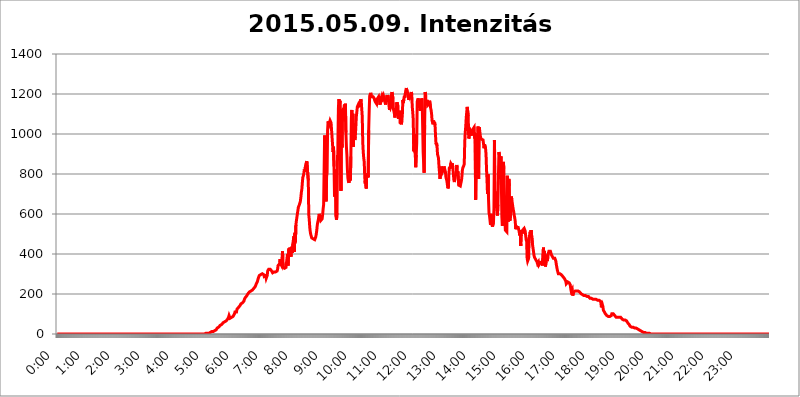
| Category | 2015.05.09. Intenzitás [W/m^2] |
|---|---|
| 0.0 | 0 |
| 0.0006944444444444445 | 0 |
| 0.001388888888888889 | 0 |
| 0.0020833333333333333 | 0 |
| 0.002777777777777778 | 0 |
| 0.003472222222222222 | 0 |
| 0.004166666666666667 | 0 |
| 0.004861111111111111 | 0 |
| 0.005555555555555556 | 0 |
| 0.0062499999999999995 | 0 |
| 0.006944444444444444 | 0 |
| 0.007638888888888889 | 0 |
| 0.008333333333333333 | 0 |
| 0.009027777777777779 | 0 |
| 0.009722222222222222 | 0 |
| 0.010416666666666666 | 0 |
| 0.011111111111111112 | 0 |
| 0.011805555555555555 | 0 |
| 0.012499999999999999 | 0 |
| 0.013194444444444444 | 0 |
| 0.013888888888888888 | 0 |
| 0.014583333333333332 | 0 |
| 0.015277777777777777 | 0 |
| 0.015972222222222224 | 0 |
| 0.016666666666666666 | 0 |
| 0.017361111111111112 | 0 |
| 0.018055555555555557 | 0 |
| 0.01875 | 0 |
| 0.019444444444444445 | 0 |
| 0.02013888888888889 | 0 |
| 0.020833333333333332 | 0 |
| 0.02152777777777778 | 0 |
| 0.022222222222222223 | 0 |
| 0.02291666666666667 | 0 |
| 0.02361111111111111 | 0 |
| 0.024305555555555556 | 0 |
| 0.024999999999999998 | 0 |
| 0.025694444444444447 | 0 |
| 0.02638888888888889 | 0 |
| 0.027083333333333334 | 0 |
| 0.027777777777777776 | 0 |
| 0.02847222222222222 | 0 |
| 0.029166666666666664 | 0 |
| 0.029861111111111113 | 0 |
| 0.030555555555555555 | 0 |
| 0.03125 | 0 |
| 0.03194444444444445 | 0 |
| 0.03263888888888889 | 0 |
| 0.03333333333333333 | 0 |
| 0.034027777777777775 | 0 |
| 0.034722222222222224 | 0 |
| 0.035416666666666666 | 0 |
| 0.036111111111111115 | 0 |
| 0.03680555555555556 | 0 |
| 0.0375 | 0 |
| 0.03819444444444444 | 0 |
| 0.03888888888888889 | 0 |
| 0.03958333333333333 | 0 |
| 0.04027777777777778 | 0 |
| 0.04097222222222222 | 0 |
| 0.041666666666666664 | 0 |
| 0.042361111111111106 | 0 |
| 0.04305555555555556 | 0 |
| 0.043750000000000004 | 0 |
| 0.044444444444444446 | 0 |
| 0.04513888888888889 | 0 |
| 0.04583333333333334 | 0 |
| 0.04652777777777778 | 0 |
| 0.04722222222222222 | 0 |
| 0.04791666666666666 | 0 |
| 0.04861111111111111 | 0 |
| 0.049305555555555554 | 0 |
| 0.049999999999999996 | 0 |
| 0.05069444444444445 | 0 |
| 0.051388888888888894 | 0 |
| 0.052083333333333336 | 0 |
| 0.05277777777777778 | 0 |
| 0.05347222222222222 | 0 |
| 0.05416666666666667 | 0 |
| 0.05486111111111111 | 0 |
| 0.05555555555555555 | 0 |
| 0.05625 | 0 |
| 0.05694444444444444 | 0 |
| 0.057638888888888885 | 0 |
| 0.05833333333333333 | 0 |
| 0.05902777777777778 | 0 |
| 0.059722222222222225 | 0 |
| 0.06041666666666667 | 0 |
| 0.061111111111111116 | 0 |
| 0.06180555555555556 | 0 |
| 0.0625 | 0 |
| 0.06319444444444444 | 0 |
| 0.06388888888888888 | 0 |
| 0.06458333333333334 | 0 |
| 0.06527777777777778 | 0 |
| 0.06597222222222222 | 0 |
| 0.06666666666666667 | 0 |
| 0.06736111111111111 | 0 |
| 0.06805555555555555 | 0 |
| 0.06874999999999999 | 0 |
| 0.06944444444444443 | 0 |
| 0.07013888888888889 | 0 |
| 0.07083333333333333 | 0 |
| 0.07152777777777779 | 0 |
| 0.07222222222222223 | 0 |
| 0.07291666666666667 | 0 |
| 0.07361111111111111 | 0 |
| 0.07430555555555556 | 0 |
| 0.075 | 0 |
| 0.07569444444444444 | 0 |
| 0.0763888888888889 | 0 |
| 0.07708333333333334 | 0 |
| 0.07777777777777778 | 0 |
| 0.07847222222222222 | 0 |
| 0.07916666666666666 | 0 |
| 0.0798611111111111 | 0 |
| 0.08055555555555556 | 0 |
| 0.08125 | 0 |
| 0.08194444444444444 | 0 |
| 0.08263888888888889 | 0 |
| 0.08333333333333333 | 0 |
| 0.08402777777777777 | 0 |
| 0.08472222222222221 | 0 |
| 0.08541666666666665 | 0 |
| 0.08611111111111112 | 0 |
| 0.08680555555555557 | 0 |
| 0.08750000000000001 | 0 |
| 0.08819444444444445 | 0 |
| 0.08888888888888889 | 0 |
| 0.08958333333333333 | 0 |
| 0.09027777777777778 | 0 |
| 0.09097222222222222 | 0 |
| 0.09166666666666667 | 0 |
| 0.09236111111111112 | 0 |
| 0.09305555555555556 | 0 |
| 0.09375 | 0 |
| 0.09444444444444444 | 0 |
| 0.09513888888888888 | 0 |
| 0.09583333333333333 | 0 |
| 0.09652777777777777 | 0 |
| 0.09722222222222222 | 0 |
| 0.09791666666666667 | 0 |
| 0.09861111111111111 | 0 |
| 0.09930555555555555 | 0 |
| 0.09999999999999999 | 0 |
| 0.10069444444444443 | 0 |
| 0.1013888888888889 | 0 |
| 0.10208333333333335 | 0 |
| 0.10277777777777779 | 0 |
| 0.10347222222222223 | 0 |
| 0.10416666666666667 | 0 |
| 0.10486111111111111 | 0 |
| 0.10555555555555556 | 0 |
| 0.10625 | 0 |
| 0.10694444444444444 | 0 |
| 0.1076388888888889 | 0 |
| 0.10833333333333334 | 0 |
| 0.10902777777777778 | 0 |
| 0.10972222222222222 | 0 |
| 0.1111111111111111 | 0 |
| 0.11180555555555556 | 0 |
| 0.11180555555555556 | 0 |
| 0.1125 | 0 |
| 0.11319444444444444 | 0 |
| 0.11388888888888889 | 0 |
| 0.11458333333333333 | 0 |
| 0.11527777777777777 | 0 |
| 0.11597222222222221 | 0 |
| 0.11666666666666665 | 0 |
| 0.1173611111111111 | 0 |
| 0.11805555555555557 | 0 |
| 0.11944444444444445 | 0 |
| 0.12013888888888889 | 0 |
| 0.12083333333333333 | 0 |
| 0.12152777777777778 | 0 |
| 0.12222222222222223 | 0 |
| 0.12291666666666667 | 0 |
| 0.12291666666666667 | 0 |
| 0.12361111111111112 | 0 |
| 0.12430555555555556 | 0 |
| 0.125 | 0 |
| 0.12569444444444444 | 0 |
| 0.12638888888888888 | 0 |
| 0.12708333333333333 | 0 |
| 0.16875 | 0 |
| 0.12847222222222224 | 0 |
| 0.12916666666666668 | 0 |
| 0.12986111111111112 | 0 |
| 0.13055555555555556 | 0 |
| 0.13125 | 0 |
| 0.13194444444444445 | 0 |
| 0.1326388888888889 | 0 |
| 0.13333333333333333 | 0 |
| 0.13402777777777777 | 0 |
| 0.13402777777777777 | 0 |
| 0.13472222222222222 | 0 |
| 0.13541666666666666 | 0 |
| 0.1361111111111111 | 0 |
| 0.13749999999999998 | 0 |
| 0.13819444444444443 | 0 |
| 0.1388888888888889 | 0 |
| 0.13958333333333334 | 0 |
| 0.14027777777777778 | 0 |
| 0.14097222222222222 | 0 |
| 0.14166666666666666 | 0 |
| 0.1423611111111111 | 0 |
| 0.14305555555555557 | 0 |
| 0.14375000000000002 | 0 |
| 0.14444444444444446 | 0 |
| 0.1451388888888889 | 0 |
| 0.1451388888888889 | 0 |
| 0.14652777777777778 | 0 |
| 0.14722222222222223 | 0 |
| 0.14791666666666667 | 0 |
| 0.1486111111111111 | 0 |
| 0.14930555555555555 | 0 |
| 0.15 | 0 |
| 0.15069444444444444 | 0 |
| 0.15138888888888888 | 0 |
| 0.15208333333333332 | 0 |
| 0.15277777777777776 | 0 |
| 0.15347222222222223 | 0 |
| 0.15416666666666667 | 0 |
| 0.15486111111111112 | 0 |
| 0.15555555555555556 | 0 |
| 0.15625 | 0 |
| 0.15694444444444444 | 0 |
| 0.15763888888888888 | 0 |
| 0.15833333333333333 | 0 |
| 0.15902777777777777 | 0 |
| 0.15972222222222224 | 0 |
| 0.16041666666666668 | 0 |
| 0.16111111111111112 | 0 |
| 0.16180555555555556 | 0 |
| 0.1625 | 0 |
| 0.16319444444444445 | 0 |
| 0.1638888888888889 | 0 |
| 0.16458333333333333 | 0 |
| 0.16527777777777777 | 0 |
| 0.16597222222222222 | 0 |
| 0.16666666666666666 | 0 |
| 0.1673611111111111 | 0 |
| 0.16805555555555554 | 0 |
| 0.16874999999999998 | 0 |
| 0.16944444444444443 | 0 |
| 0.17013888888888887 | 0 |
| 0.1708333333333333 | 0 |
| 0.17152777777777775 | 0 |
| 0.17222222222222225 | 0 |
| 0.1729166666666667 | 0 |
| 0.17361111111111113 | 0 |
| 0.17430555555555557 | 0 |
| 0.17500000000000002 | 0 |
| 0.17569444444444446 | 0 |
| 0.1763888888888889 | 0 |
| 0.17708333333333334 | 0 |
| 0.17777777777777778 | 0 |
| 0.17847222222222223 | 0 |
| 0.17916666666666667 | 0 |
| 0.1798611111111111 | 0 |
| 0.18055555555555555 | 0 |
| 0.18125 | 0 |
| 0.18194444444444444 | 0 |
| 0.1826388888888889 | 0 |
| 0.18333333333333335 | 0 |
| 0.1840277777777778 | 0 |
| 0.18472222222222223 | 0 |
| 0.18541666666666667 | 0 |
| 0.18611111111111112 | 0 |
| 0.18680555555555556 | 0 |
| 0.1875 | 0 |
| 0.18819444444444444 | 0 |
| 0.18888888888888888 | 0 |
| 0.18958333333333333 | 0 |
| 0.19027777777777777 | 0 |
| 0.1909722222222222 | 0 |
| 0.19166666666666665 | 0 |
| 0.19236111111111112 | 0 |
| 0.19305555555555554 | 0 |
| 0.19375 | 0 |
| 0.19444444444444445 | 0 |
| 0.1951388888888889 | 0 |
| 0.19583333333333333 | 0 |
| 0.19652777777777777 | 0 |
| 0.19722222222222222 | 0 |
| 0.19791666666666666 | 0 |
| 0.1986111111111111 | 0 |
| 0.19930555555555554 | 0 |
| 0.19999999999999998 | 0 |
| 0.20069444444444443 | 0 |
| 0.20138888888888887 | 0 |
| 0.2020833333333333 | 0 |
| 0.2027777777777778 | 0 |
| 0.2034722222222222 | 0 |
| 0.2041666666666667 | 0 |
| 0.20486111111111113 | 0 |
| 0.20555555555555557 | 0 |
| 0.20625000000000002 | 0 |
| 0.20694444444444446 | 0 |
| 0.2076388888888889 | 0 |
| 0.20833333333333334 | 3.525 |
| 0.20902777777777778 | 3.525 |
| 0.20972222222222223 | 3.525 |
| 0.21041666666666667 | 3.525 |
| 0.2111111111111111 | 3.525 |
| 0.21180555555555555 | 3.525 |
| 0.2125 | 3.525 |
| 0.21319444444444444 | 3.525 |
| 0.2138888888888889 | 7.887 |
| 0.21458333333333335 | 7.887 |
| 0.2152777777777778 | 7.887 |
| 0.21597222222222223 | 7.887 |
| 0.21666666666666667 | 12.257 |
| 0.21736111111111112 | 12.257 |
| 0.21805555555555556 | 12.257 |
| 0.21875 | 12.257 |
| 0.21944444444444444 | 16.636 |
| 0.22013888888888888 | 16.636 |
| 0.22083333333333333 | 16.636 |
| 0.22152777777777777 | 21.024 |
| 0.2222222222222222 | 21.024 |
| 0.22291666666666665 | 21.024 |
| 0.2236111111111111 | 25.419 |
| 0.22430555555555556 | 29.823 |
| 0.225 | 29.823 |
| 0.22569444444444445 | 34.234 |
| 0.2263888888888889 | 34.234 |
| 0.22708333333333333 | 38.653 |
| 0.22777777777777777 | 38.653 |
| 0.22847222222222222 | 43.079 |
| 0.22916666666666666 | 43.079 |
| 0.2298611111111111 | 47.511 |
| 0.23055555555555554 | 47.511 |
| 0.23124999999999998 | 51.951 |
| 0.23194444444444443 | 51.951 |
| 0.23263888888888887 | 56.398 |
| 0.2333333333333333 | 56.398 |
| 0.2340277777777778 | 56.398 |
| 0.2347222222222222 | 60.85 |
| 0.2354166666666667 | 60.85 |
| 0.23611111111111113 | 65.31 |
| 0.23680555555555557 | 65.31 |
| 0.23750000000000002 | 65.31 |
| 0.23819444444444446 | 69.775 |
| 0.2388888888888889 | 74.246 |
| 0.23958333333333334 | 74.246 |
| 0.24027777777777778 | 83.205 |
| 0.24097222222222223 | 92.184 |
| 0.24166666666666667 | 87.692 |
| 0.2423611111111111 | 78.722 |
| 0.24305555555555555 | 78.722 |
| 0.24375 | 83.205 |
| 0.24444444444444446 | 83.205 |
| 0.24513888888888888 | 83.205 |
| 0.24583333333333335 | 83.205 |
| 0.2465277777777778 | 87.692 |
| 0.24722222222222223 | 92.184 |
| 0.24791666666666667 | 92.184 |
| 0.24861111111111112 | 101.184 |
| 0.24930555555555556 | 110.201 |
| 0.25 | 110.201 |
| 0.25069444444444444 | 110.201 |
| 0.2513888888888889 | 110.201 |
| 0.2520833333333333 | 123.758 |
| 0.25277777777777777 | 128.284 |
| 0.2534722222222222 | 128.284 |
| 0.25416666666666665 | 132.814 |
| 0.2548611111111111 | 132.814 |
| 0.2555555555555556 | 137.347 |
| 0.25625000000000003 | 141.884 |
| 0.2569444444444445 | 146.423 |
| 0.2576388888888889 | 150.964 |
| 0.25833333333333336 | 150.964 |
| 0.2590277777777778 | 155.509 |
| 0.25972222222222224 | 155.509 |
| 0.2604166666666667 | 160.056 |
| 0.2611111111111111 | 160.056 |
| 0.26180555555555557 | 164.605 |
| 0.2625 | 173.709 |
| 0.26319444444444445 | 178.264 |
| 0.2638888888888889 | 182.82 |
| 0.26458333333333334 | 187.378 |
| 0.2652777777777778 | 187.378 |
| 0.2659722222222222 | 191.937 |
| 0.26666666666666666 | 191.937 |
| 0.2673611111111111 | 201.058 |
| 0.26805555555555555 | 205.62 |
| 0.26875 | 205.62 |
| 0.26944444444444443 | 210.182 |
| 0.2701388888888889 | 210.182 |
| 0.2708333333333333 | 210.182 |
| 0.27152777777777776 | 214.746 |
| 0.2722222222222222 | 214.746 |
| 0.27291666666666664 | 214.746 |
| 0.2736111111111111 | 219.309 |
| 0.2743055555555555 | 219.309 |
| 0.27499999999999997 | 223.873 |
| 0.27569444444444446 | 228.436 |
| 0.27638888888888885 | 228.436 |
| 0.27708333333333335 | 233 |
| 0.2777777777777778 | 237.564 |
| 0.27847222222222223 | 242.127 |
| 0.2791666666666667 | 251.251 |
| 0.2798611111111111 | 255.813 |
| 0.28055555555555556 | 260.373 |
| 0.28125 | 269.49 |
| 0.28194444444444444 | 278.603 |
| 0.2826388888888889 | 283.156 |
| 0.2833333333333333 | 292.259 |
| 0.28402777777777777 | 296.808 |
| 0.2847222222222222 | 296.808 |
| 0.28541666666666665 | 296.808 |
| 0.28611111111111115 | 296.808 |
| 0.28680555555555554 | 301.354 |
| 0.28750000000000003 | 301.354 |
| 0.2881944444444445 | 296.808 |
| 0.2888888888888889 | 296.808 |
| 0.28958333333333336 | 296.808 |
| 0.2902777777777778 | 287.709 |
| 0.29097222222222224 | 287.709 |
| 0.2916666666666667 | 283.156 |
| 0.2923611111111111 | 292.259 |
| 0.29305555555555557 | 278.603 |
| 0.29375 | 278.603 |
| 0.29444444444444445 | 292.259 |
| 0.2951388888888889 | 314.98 |
| 0.29583333333333334 | 314.98 |
| 0.2965277777777778 | 324.052 |
| 0.2972222222222222 | 324.052 |
| 0.29791666666666666 | 328.584 |
| 0.2986111111111111 | 324.052 |
| 0.29930555555555555 | 324.052 |
| 0.3 | 319.517 |
| 0.30069444444444443 | 314.98 |
| 0.3013888888888889 | 310.44 |
| 0.3020833333333333 | 305.898 |
| 0.30277777777777776 | 305.898 |
| 0.3034722222222222 | 305.898 |
| 0.30416666666666664 | 310.44 |
| 0.3048611111111111 | 310.44 |
| 0.3055555555555555 | 314.98 |
| 0.30624999999999997 | 310.44 |
| 0.3069444444444444 | 310.44 |
| 0.3076388888888889 | 314.98 |
| 0.30833333333333335 | 314.98 |
| 0.3090277777777778 | 324.052 |
| 0.30972222222222223 | 342.162 |
| 0.3104166666666667 | 342.162 |
| 0.3111111111111111 | 337.639 |
| 0.31180555555555556 | 351.198 |
| 0.3125 | 373.729 |
| 0.31319444444444444 | 351.198 |
| 0.3138888888888889 | 346.682 |
| 0.3145833333333333 | 342.162 |
| 0.31527777777777777 | 342.162 |
| 0.3159722222222222 | 414.035 |
| 0.31666666666666665 | 333.113 |
| 0.31736111111111115 | 328.584 |
| 0.31805555555555554 | 328.584 |
| 0.31875000000000003 | 328.584 |
| 0.3194444444444445 | 328.584 |
| 0.3201388888888889 | 328.584 |
| 0.32083333333333336 | 333.113 |
| 0.3215277777777778 | 333.113 |
| 0.32222222222222224 | 337.639 |
| 0.3229166666666667 | 400.638 |
| 0.3236111111111111 | 342.162 |
| 0.32430555555555557 | 342.162 |
| 0.325 | 427.39 |
| 0.32569444444444445 | 387.202 |
| 0.3263888888888889 | 431.833 |
| 0.32708333333333334 | 436.27 |
| 0.3277777777777778 | 387.202 |
| 0.3284722222222222 | 436.27 |
| 0.32916666666666666 | 422.943 |
| 0.3298611111111111 | 405.108 |
| 0.33055555555555555 | 453.968 |
| 0.33125 | 458.38 |
| 0.33194444444444443 | 489.108 |
| 0.3326388888888889 | 409.574 |
| 0.3333333333333333 | 506.542 |
| 0.3340277777777778 | 458.38 |
| 0.3347222222222222 | 545.416 |
| 0.3354166666666667 | 566.793 |
| 0.3361111111111111 | 583.779 |
| 0.3368055555555556 | 600.661 |
| 0.33749999999999997 | 617.436 |
| 0.33819444444444446 | 634.105 |
| 0.33888888888888885 | 638.256 |
| 0.33958333333333335 | 646.537 |
| 0.34027777777777773 | 650.667 |
| 0.34097222222222223 | 663.019 |
| 0.3416666666666666 | 683.473 |
| 0.3423611111111111 | 707.8 |
| 0.3430555555555555 | 723.889 |
| 0.34375 | 755.766 |
| 0.3444444444444445 | 783.342 |
| 0.3451388888888889 | 791.169 |
| 0.3458333333333334 | 802.868 |
| 0.34652777777777777 | 822.26 |
| 0.34722222222222227 | 810.641 |
| 0.34791666666666665 | 833.834 |
| 0.34861111111111115 | 849.199 |
| 0.34930555555555554 | 856.855 |
| 0.35000000000000003 | 864.493 |
| 0.3506944444444444 | 868.305 |
| 0.3513888888888889 | 864.493 |
| 0.3520833333333333 | 767.62 |
| 0.3527777777777778 | 596.45 |
| 0.3534722222222222 | 571.049 |
| 0.3541666666666667 | 532.513 |
| 0.3548611111111111 | 510.885 |
| 0.35555555555555557 | 497.836 |
| 0.35625 | 489.108 |
| 0.35694444444444445 | 480.356 |
| 0.3576388888888889 | 475.972 |
| 0.35833333333333334 | 475.972 |
| 0.3590277777777778 | 475.972 |
| 0.3597222222222222 | 471.582 |
| 0.36041666666666666 | 471.582 |
| 0.3611111111111111 | 471.582 |
| 0.36180555555555555 | 475.972 |
| 0.3625 | 484.735 |
| 0.36319444444444443 | 497.836 |
| 0.3638888888888889 | 515.223 |
| 0.3645833333333333 | 541.121 |
| 0.3652777777777778 | 558.261 |
| 0.3659722222222222 | 566.793 |
| 0.3666666666666667 | 566.793 |
| 0.3673611111111111 | 600.661 |
| 0.3680555555555556 | 592.233 |
| 0.36874999999999997 | 575.299 |
| 0.36944444444444446 | 566.793 |
| 0.37013888888888885 | 562.53 |
| 0.37083333333333335 | 566.793 |
| 0.37152777777777773 | 575.299 |
| 0.37222222222222223 | 596.45 |
| 0.3729166666666666 | 625.784 |
| 0.3736111111111111 | 646.537 |
| 0.3743055555555555 | 650.667 |
| 0.375 | 992.448 |
| 0.3756944444444445 | 883.516 |
| 0.3763888888888889 | 743.859 |
| 0.3770833333333334 | 663.019 |
| 0.37777777777777777 | 787.258 |
| 0.37847222222222227 | 806.757 |
| 0.37916666666666665 | 1018.587 |
| 0.37986111111111115 | 1063.51 |
| 0.38055555555555554 | 1056.004 |
| 0.38125000000000003 | 1048.508 |
| 0.3819444444444444 | 1044.762 |
| 0.3826388888888889 | 1067.267 |
| 0.3833333333333333 | 1071.027 |
| 0.3840277777777778 | 1056.004 |
| 0.3847222222222222 | 1052.255 |
| 0.3854166666666667 | 984.98 |
| 0.3861111111111111 | 988.714 |
| 0.38680555555555557 | 909.996 |
| 0.3875 | 936.33 |
| 0.38819444444444445 | 837.682 |
| 0.3888888888888889 | 687.544 |
| 0.38958333333333334 | 755.766 |
| 0.3902777777777778 | 822.26 |
| 0.3909722222222222 | 588.009 |
| 0.39166666666666666 | 571.049 |
| 0.3923611111111111 | 604.864 |
| 0.39305555555555555 | 894.885 |
| 0.39375 | 868.305 |
| 0.39444444444444443 | 1139.384 |
| 0.3951388888888889 | 1174.263 |
| 0.3958333333333333 | 1147.086 |
| 0.3965277777777778 | 1166.46 |
| 0.3972222222222222 | 1162.571 |
| 0.3979166666666667 | 715.858 |
| 0.3986111111111111 | 1052.255 |
| 0.3993055555555556 | 932.576 |
| 0.39999999999999997 | 1120.238 |
| 0.40069444444444446 | 1116.426 |
| 0.40138888888888885 | 1120.238 |
| 0.40208333333333335 | 1127.879 |
| 0.40277777777777773 | 1147.086 |
| 0.40347222222222223 | 1063.51 |
| 0.4041666666666666 | 1150.946 |
| 0.4048611111111111 | 1007.383 |
| 0.4055555555555555 | 936.33 |
| 0.40625 | 894.885 |
| 0.4069444444444445 | 822.26 |
| 0.4076388888888889 | 779.42 |
| 0.4083333333333334 | 763.674 |
| 0.40902777777777777 | 755.766 |
| 0.40972222222222227 | 771.559 |
| 0.41041666666666665 | 779.42 |
| 0.41111111111111115 | 767.62 |
| 0.41180555555555554 | 887.309 |
| 0.41250000000000003 | 1078.555 |
| 0.4131944444444444 | 1120.238 |
| 0.4138888888888889 | 966.295 |
| 0.4145833333333333 | 1101.226 |
| 0.4152777777777778 | 936.33 |
| 0.4159722222222222 | 1052.255 |
| 0.4166666666666667 | 1003.65 |
| 0.4173611111111111 | 970.034 |
| 0.41805555555555557 | 988.714 |
| 0.41875 | 1033.537 |
| 0.41944444444444445 | 1086.097 |
| 0.4201388888888889 | 1108.816 |
| 0.42083333333333334 | 1135.543 |
| 0.4215277777777778 | 1139.384 |
| 0.4222222222222222 | 1147.086 |
| 0.42291666666666666 | 1139.384 |
| 0.4236111111111111 | 1135.543 |
| 0.42430555555555555 | 1135.543 |
| 0.425 | 1147.086 |
| 0.42569444444444443 | 1174.263 |
| 0.4263888888888889 | 1162.571 |
| 0.4270833333333333 | 1124.056 |
| 0.4277777777777778 | 1086.097 |
| 0.4284722222222222 | 958.814 |
| 0.4291666666666667 | 909.996 |
| 0.4298611111111111 | 879.719 |
| 0.4305555555555556 | 860.676 |
| 0.43124999999999997 | 787.258 |
| 0.43194444444444446 | 751.803 |
| 0.43263888888888885 | 795.074 |
| 0.43333333333333335 | 727.896 |
| 0.43402777777777773 | 795.074 |
| 0.43472222222222223 | 783.342 |
| 0.4354166666666666 | 802.868 |
| 0.4361111111111111 | 783.342 |
| 0.4368055555555555 | 1018.587 |
| 0.4375 | 1116.426 |
| 0.4381944444444445 | 1189.969 |
| 0.4388888888888889 | 1197.876 |
| 0.4395833333333334 | 1205.82 |
| 0.44027777777777777 | 1193.918 |
| 0.44097222222222227 | 1186.03 |
| 0.44166666666666665 | 1186.03 |
| 0.44236111111111115 | 1186.03 |
| 0.44305555555555554 | 1186.03 |
| 0.44375000000000003 | 1186.03 |
| 0.4444444444444444 | 1178.177 |
| 0.4451388888888889 | 1182.099 |
| 0.4458333333333333 | 1162.571 |
| 0.4465277777777778 | 1162.571 |
| 0.4472222222222222 | 1162.571 |
| 0.4479166666666667 | 1150.946 |
| 0.4486111111111111 | 1174.263 |
| 0.44930555555555557 | 1178.177 |
| 0.45 | 1178.177 |
| 0.45069444444444445 | 1186.03 |
| 0.4513888888888889 | 1170.358 |
| 0.45208333333333334 | 1178.177 |
| 0.4527777777777778 | 1147.086 |
| 0.4534722222222222 | 1174.263 |
| 0.45416666666666666 | 1158.689 |
| 0.4548611111111111 | 1186.03 |
| 0.45555555555555555 | 1193.918 |
| 0.45625 | 1189.969 |
| 0.45694444444444443 | 1182.099 |
| 0.4576388888888889 | 1189.969 |
| 0.4583333333333333 | 1189.969 |
| 0.4590277777777778 | 1170.358 |
| 0.4597222222222222 | 1166.46 |
| 0.4604166666666667 | 1147.086 |
| 0.4611111111111111 | 1178.177 |
| 0.4618055555555556 | 1170.358 |
| 0.46249999999999997 | 1193.918 |
| 0.46319444444444446 | 1186.03 |
| 0.46388888888888885 | 1193.918 |
| 0.46458333333333335 | 1166.46 |
| 0.46527777777777773 | 1170.358 |
| 0.46597222222222223 | 1120.238 |
| 0.4666666666666666 | 1139.384 |
| 0.4673611111111111 | 1131.708 |
| 0.4680555555555555 | 1139.384 |
| 0.46875 | 1193.918 |
| 0.4694444444444445 | 1209.807 |
| 0.4701388888888889 | 1205.82 |
| 0.4708333333333334 | 1178.177 |
| 0.47152777777777777 | 1124.056 |
| 0.47222222222222227 | 1127.879 |
| 0.47291666666666665 | 1101.226 |
| 0.47361111111111115 | 1082.324 |
| 0.47430555555555554 | 1112.618 |
| 0.47500000000000003 | 1093.653 |
| 0.4756944444444444 | 1097.437 |
| 0.4763888888888889 | 1158.689 |
| 0.4770833333333333 | 1158.689 |
| 0.4777777777777778 | 1139.384 |
| 0.4784722222222222 | 1074.789 |
| 0.4791666666666667 | 1112.618 |
| 0.4798611111111111 | 1097.437 |
| 0.48055555555555557 | 1116.426 |
| 0.48125 | 1052.255 |
| 0.48194444444444445 | 1067.267 |
| 0.4826388888888889 | 1048.508 |
| 0.48333333333333334 | 1067.267 |
| 0.4840277777777778 | 1097.437 |
| 0.4847222222222222 | 1170.358 |
| 0.48541666666666666 | 1154.814 |
| 0.4861111111111111 | 1174.263 |
| 0.48680555555555555 | 1189.969 |
| 0.4875 | 1182.099 |
| 0.48819444444444443 | 1201.843 |
| 0.4888888888888889 | 1217.812 |
| 0.4895833333333333 | 1229.899 |
| 0.4902777777777778 | 1233.951 |
| 0.4909722222222222 | 1209.807 |
| 0.4916666666666667 | 1201.843 |
| 0.4923611111111111 | 1193.918 |
| 0.4930555555555556 | 1170.358 |
| 0.49374999999999997 | 1193.918 |
| 0.49444444444444446 | 1186.03 |
| 0.49513888888888885 | 1193.918 |
| 0.49583333333333335 | 1201.843 |
| 0.49652777777777773 | 1209.807 |
| 0.49722222222222223 | 1197.876 |
| 0.4979166666666666 | 1135.543 |
| 0.4986111111111111 | 1108.816 |
| 0.4993055555555555 | 1071.027 |
| 0.5 | 913.766 |
| 0.5006944444444444 | 999.916 |
| 0.5013888888888889 | 909.996 |
| 0.5020833333333333 | 902.447 |
| 0.5027777777777778 | 833.834 |
| 0.5034722222222222 | 894.885 |
| 0.5041666666666667 | 955.071 |
| 0.5048611111111111 | 1162.571 |
| 0.5055555555555555 | 1170.358 |
| 0.50625 | 1178.177 |
| 0.5069444444444444 | 1182.099 |
| 0.5076388888888889 | 1131.708 |
| 0.5083333333333333 | 1143.232 |
| 0.5090277777777777 | 1116.426 |
| 0.5097222222222222 | 1135.543 |
| 0.5104166666666666 | 1135.543 |
| 0.5111111111111112 | 1178.177 |
| 0.5118055555555555 | 1170.358 |
| 0.5125000000000001 | 1174.263 |
| 0.5131944444444444 | 909.996 |
| 0.513888888888889 | 856.855 |
| 0.5145833333333333 | 806.757 |
| 0.5152777777777778 | 1044.762 |
| 0.5159722222222222 | 1209.807 |
| 0.5166666666666667 | 1193.918 |
| 0.517361111111111 | 1154.814 |
| 0.5180555555555556 | 1162.571 |
| 0.5187499999999999 | 1170.358 |
| 0.5194444444444445 | 1143.232 |
| 0.5201388888888888 | 1147.086 |
| 0.5208333333333334 | 1139.384 |
| 0.5215277777777778 | 1150.946 |
| 0.5222222222222223 | 1166.46 |
| 0.5229166666666667 | 1162.571 |
| 0.5236111111111111 | 1131.708 |
| 0.5243055555555556 | 1120.238 |
| 0.525 | 1101.226 |
| 0.5256944444444445 | 1067.267 |
| 0.5263888888888889 | 1063.51 |
| 0.5270833333333333 | 1048.508 |
| 0.5277777777777778 | 1067.267 |
| 0.5284722222222222 | 1052.255 |
| 0.5291666666666667 | 1059.756 |
| 0.5298611111111111 | 1044.762 |
| 0.5305555555555556 | 992.448 |
| 0.53125 | 947.58 |
| 0.5319444444444444 | 955.071 |
| 0.5326388888888889 | 940.082 |
| 0.5333333333333333 | 898.668 |
| 0.5340277777777778 | 894.885 |
| 0.5347222222222222 | 879.719 |
| 0.5354166666666667 | 837.682 |
| 0.5361111111111111 | 806.757 |
| 0.5368055555555555 | 775.492 |
| 0.5375 | 775.492 |
| 0.5381944444444444 | 818.392 |
| 0.5388888888888889 | 837.682 |
| 0.5395833333333333 | 837.682 |
| 0.5402777777777777 | 810.641 |
| 0.5409722222222222 | 806.757 |
| 0.5416666666666666 | 822.26 |
| 0.5423611111111112 | 837.682 |
| 0.5430555555555555 | 829.981 |
| 0.5437500000000001 | 826.123 |
| 0.5444444444444444 | 810.641 |
| 0.545138888888889 | 783.342 |
| 0.5458333333333333 | 775.492 |
| 0.5465277777777778 | 763.674 |
| 0.5472222222222222 | 763.674 |
| 0.5479166666666667 | 727.896 |
| 0.548611111111111 | 735.89 |
| 0.5493055555555556 | 798.974 |
| 0.5499999999999999 | 833.834 |
| 0.5506944444444445 | 826.123 |
| 0.5513888888888888 | 829.981 |
| 0.5520833333333334 | 853.029 |
| 0.5527777777777778 | 856.855 |
| 0.5534722222222223 | 845.365 |
| 0.5541666666666667 | 853.029 |
| 0.5548611111111111 | 829.981 |
| 0.5555555555555556 | 798.974 |
| 0.55625 | 771.559 |
| 0.5569444444444445 | 759.723 |
| 0.5576388888888889 | 775.492 |
| 0.5583333333333333 | 771.559 |
| 0.5590277777777778 | 779.42 |
| 0.5597222222222222 | 814.519 |
| 0.5604166666666667 | 845.365 |
| 0.5611111111111111 | 795.074 |
| 0.5618055555555556 | 814.519 |
| 0.5625 | 818.392 |
| 0.5631944444444444 | 743.859 |
| 0.5638888888888889 | 747.834 |
| 0.5645833333333333 | 747.834 |
| 0.5652777777777778 | 739.877 |
| 0.5659722222222222 | 751.803 |
| 0.5666666666666667 | 763.674 |
| 0.5673611111111111 | 779.42 |
| 0.5680555555555555 | 814.519 |
| 0.56875 | 829.981 |
| 0.5694444444444444 | 826.123 |
| 0.5701388888888889 | 841.526 |
| 0.5708333333333333 | 849.199 |
| 0.5715277777777777 | 958.814 |
| 0.5722222222222222 | 1007.383 |
| 0.5729166666666666 | 1037.277 |
| 0.5736111111111112 | 1082.324 |
| 0.5743055555555555 | 1086.097 |
| 0.5750000000000001 | 1135.543 |
| 0.5756944444444444 | 1131.708 |
| 0.576388888888889 | 1089.873 |
| 0.5770833333333333 | 977.508 |
| 0.5777777777777778 | 984.98 |
| 0.5784722222222222 | 1007.383 |
| 0.5791666666666667 | 992.448 |
| 0.579861111111111 | 1018.587 |
| 0.5805555555555556 | 1018.587 |
| 0.5812499999999999 | 1011.118 |
| 0.5819444444444445 | 999.916 |
| 0.5826388888888888 | 992.448 |
| 0.5833333333333334 | 1026.06 |
| 0.5840277777777778 | 1029.798 |
| 0.5847222222222223 | 1033.537 |
| 0.5854166666666667 | 977.508 |
| 0.5861111111111111 | 1003.65 |
| 0.5868055555555556 | 671.22 |
| 0.5875 | 829.981 |
| 0.5881944444444445 | 977.508 |
| 0.5888888888888889 | 940.082 |
| 0.5895833333333333 | 958.814 |
| 0.5902777777777778 | 1037.277 |
| 0.5909722222222222 | 775.492 |
| 0.5916666666666667 | 1033.537 |
| 0.5923611111111111 | 1022.323 |
| 0.5930555555555556 | 999.916 |
| 0.59375 | 981.244 |
| 0.5944444444444444 | 981.244 |
| 0.5951388888888889 | 973.772 |
| 0.5958333333333333 | 973.772 |
| 0.5965277777777778 | 977.508 |
| 0.5972222222222222 | 970.034 |
| 0.5979166666666667 | 970.034 |
| 0.5986111111111111 | 928.819 |
| 0.5993055555555555 | 947.58 |
| 0.6 | 943.832 |
| 0.6006944444444444 | 928.819 |
| 0.6013888888888889 | 898.668 |
| 0.6020833333333333 | 822.26 |
| 0.6027777777777777 | 767.62 |
| 0.6034722222222222 | 699.717 |
| 0.6041666666666666 | 798.974 |
| 0.6048611111111112 | 675.311 |
| 0.6055555555555555 | 604.864 |
| 0.6062500000000001 | 592.233 |
| 0.6069444444444444 | 588.009 |
| 0.607638888888889 | 545.416 |
| 0.6083333333333333 | 600.661 |
| 0.6090277777777778 | 558.261 |
| 0.6097222222222222 | 545.416 |
| 0.6104166666666667 | 536.82 |
| 0.611111111111111 | 541.121 |
| 0.6118055555555556 | 558.261 |
| 0.6124999999999999 | 625.784 |
| 0.6131944444444445 | 970.034 |
| 0.6138888888888888 | 663.019 |
| 0.6145833333333334 | 658.909 |
| 0.6152777777777778 | 711.832 |
| 0.6159722222222223 | 638.256 |
| 0.6166666666666667 | 613.252 |
| 0.6173611111111111 | 592.233 |
| 0.6180555555555556 | 646.537 |
| 0.61875 | 783.342 |
| 0.6194444444444445 | 909.996 |
| 0.6201388888888889 | 894.885 |
| 0.6208333333333333 | 795.074 |
| 0.6215277777777778 | 775.492 |
| 0.6222222222222222 | 887.309 |
| 0.6229166666666667 | 743.859 |
| 0.6236111111111111 | 583.779 |
| 0.6243055555555556 | 541.121 |
| 0.625 | 679.395 |
| 0.6256944444444444 | 860.676 |
| 0.6263888888888889 | 826.123 |
| 0.6270833333333333 | 596.45 |
| 0.6277777777777778 | 575.299 |
| 0.6284722222222222 | 519.555 |
| 0.6291666666666667 | 515.223 |
| 0.6298611111111111 | 515.223 |
| 0.6305555555555555 | 510.885 |
| 0.63125 | 791.169 |
| 0.6319444444444444 | 791.169 |
| 0.6326388888888889 | 562.53 |
| 0.6333333333333333 | 775.492 |
| 0.6340277777777777 | 739.877 |
| 0.6347222222222222 | 566.793 |
| 0.6354166666666666 | 575.299 |
| 0.6361111111111112 | 600.661 |
| 0.6368055555555555 | 687.544 |
| 0.6375000000000001 | 675.311 |
| 0.6381944444444444 | 654.791 |
| 0.638888888888889 | 638.256 |
| 0.6395833333333333 | 621.613 |
| 0.6402777777777778 | 609.062 |
| 0.6409722222222222 | 592.233 |
| 0.6416666666666667 | 579.542 |
| 0.642361111111111 | 562.53 |
| 0.6430555555555556 | 523.88 |
| 0.6437499999999999 | 541.121 |
| 0.6444444444444445 | 532.513 |
| 0.6451388888888888 | 532.513 |
| 0.6458333333333334 | 532.513 |
| 0.6465277777777778 | 532.513 |
| 0.6472222222222223 | 528.2 |
| 0.6479166666666667 | 510.885 |
| 0.6486111111111111 | 493.475 |
| 0.6493055555555556 | 519.555 |
| 0.65 | 440.702 |
| 0.6506944444444445 | 497.836 |
| 0.6513888888888889 | 515.223 |
| 0.6520833333333333 | 502.192 |
| 0.6527777777777778 | 519.555 |
| 0.6534722222222222 | 519.555 |
| 0.6541666666666667 | 519.555 |
| 0.6548611111111111 | 528.2 |
| 0.6555555555555556 | 528.2 |
| 0.65625 | 515.223 |
| 0.6569444444444444 | 493.475 |
| 0.6576388888888889 | 471.582 |
| 0.6583333333333333 | 462.786 |
| 0.6590277777777778 | 378.224 |
| 0.6597222222222222 | 364.728 |
| 0.6604166666666667 | 369.23 |
| 0.6611111111111111 | 378.224 |
| 0.6618055555555555 | 475.972 |
| 0.6625 | 493.475 |
| 0.6631944444444444 | 510.885 |
| 0.6638888888888889 | 502.192 |
| 0.6645833333333333 | 519.555 |
| 0.6652777777777777 | 523.88 |
| 0.6659722222222222 | 523.88 |
| 0.6666666666666666 | 445.129 |
| 0.6673611111111111 | 427.39 |
| 0.6680555555555556 | 409.574 |
| 0.6687500000000001 | 391.685 |
| 0.6694444444444444 | 382.715 |
| 0.6701388888888888 | 378.224 |
| 0.6708333333333334 | 373.729 |
| 0.6715277777777778 | 378.224 |
| 0.6722222222222222 | 369.23 |
| 0.6729166666666666 | 360.221 |
| 0.6736111111111112 | 351.198 |
| 0.6743055555555556 | 355.712 |
| 0.6749999999999999 | 360.221 |
| 0.6756944444444444 | 346.682 |
| 0.6763888888888889 | 351.198 |
| 0.6770833333333334 | 355.712 |
| 0.6777777777777777 | 355.712 |
| 0.6784722222222223 | 355.712 |
| 0.6791666666666667 | 360.221 |
| 0.6798611111111111 | 351.198 |
| 0.6805555555555555 | 342.162 |
| 0.68125 | 342.162 |
| 0.6819444444444445 | 431.833 |
| 0.6826388888888889 | 387.202 |
| 0.6833333333333332 | 414.035 |
| 0.6840277777777778 | 418.492 |
| 0.6847222222222222 | 337.639 |
| 0.6854166666666667 | 337.639 |
| 0.686111111111111 | 333.113 |
| 0.6868055555555556 | 396.164 |
| 0.6875 | 364.728 |
| 0.6881944444444444 | 396.164 |
| 0.688888888888889 | 405.108 |
| 0.6895833333333333 | 414.035 |
| 0.6902777777777778 | 414.035 |
| 0.6909722222222222 | 414.035 |
| 0.6916666666666668 | 414.035 |
| 0.6923611111111111 | 405.108 |
| 0.6930555555555555 | 396.164 |
| 0.69375 | 391.685 |
| 0.6944444444444445 | 387.202 |
| 0.6951388888888889 | 382.715 |
| 0.6958333333333333 | 378.224 |
| 0.6965277777777777 | 378.224 |
| 0.6972222222222223 | 378.224 |
| 0.6979166666666666 | 378.224 |
| 0.6986111111111111 | 373.729 |
| 0.6993055555555556 | 364.728 |
| 0.7000000000000001 | 346.682 |
| 0.7006944444444444 | 333.113 |
| 0.7013888888888888 | 319.517 |
| 0.7020833333333334 | 310.44 |
| 0.7027777777777778 | 301.354 |
| 0.7034722222222222 | 296.808 |
| 0.7041666666666666 | 296.808 |
| 0.7048611111111112 | 301.354 |
| 0.7055555555555556 | 296.808 |
| 0.7062499999999999 | 296.808 |
| 0.7069444444444444 | 296.808 |
| 0.7076388888888889 | 296.808 |
| 0.7083333333333334 | 292.259 |
| 0.7090277777777777 | 287.709 |
| 0.7097222222222223 | 287.709 |
| 0.7104166666666667 | 287.709 |
| 0.7111111111111111 | 278.603 |
| 0.7118055555555555 | 278.603 |
| 0.7125 | 274.047 |
| 0.7131944444444445 | 264.932 |
| 0.7138888888888889 | 251.251 |
| 0.7145833333333332 | 255.813 |
| 0.7152777777777778 | 251.251 |
| 0.7159722222222222 | 260.373 |
| 0.7166666666666667 | 260.373 |
| 0.717361111111111 | 260.373 |
| 0.7180555555555556 | 255.813 |
| 0.71875 | 255.813 |
| 0.7194444444444444 | 246.689 |
| 0.720138888888889 | 228.436 |
| 0.7208333333333333 | 214.746 |
| 0.7215277777777778 | 219.309 |
| 0.7222222222222222 | 223.873 |
| 0.7229166666666668 | 191.937 |
| 0.7236111111111111 | 191.937 |
| 0.7243055555555555 | 210.182 |
| 0.725 | 210.182 |
| 0.7256944444444445 | 214.746 |
| 0.7263888888888889 | 214.746 |
| 0.7270833333333333 | 214.746 |
| 0.7277777777777777 | 214.746 |
| 0.7284722222222223 | 214.746 |
| 0.7291666666666666 | 214.746 |
| 0.7298611111111111 | 214.746 |
| 0.7305555555555556 | 214.746 |
| 0.7312500000000001 | 214.746 |
| 0.7319444444444444 | 210.182 |
| 0.7326388888888888 | 210.182 |
| 0.7333333333333334 | 205.62 |
| 0.7340277777777778 | 205.62 |
| 0.7347222222222222 | 201.058 |
| 0.7354166666666666 | 201.058 |
| 0.7361111111111112 | 201.058 |
| 0.7368055555555556 | 196.497 |
| 0.7374999999999999 | 196.497 |
| 0.7381944444444444 | 191.937 |
| 0.7388888888888889 | 191.937 |
| 0.7395833333333334 | 191.937 |
| 0.7402777777777777 | 191.937 |
| 0.7409722222222223 | 191.937 |
| 0.7416666666666667 | 191.937 |
| 0.7423611111111111 | 191.937 |
| 0.7430555555555555 | 187.378 |
| 0.74375 | 187.378 |
| 0.7444444444444445 | 187.378 |
| 0.7451388888888889 | 187.378 |
| 0.7458333333333332 | 182.82 |
| 0.7465277777777778 | 182.82 |
| 0.7472222222222222 | 178.264 |
| 0.7479166666666667 | 178.264 |
| 0.748611111111111 | 178.264 |
| 0.7493055555555556 | 178.264 |
| 0.75 | 178.264 |
| 0.7506944444444444 | 173.709 |
| 0.751388888888889 | 173.709 |
| 0.7520833333333333 | 173.709 |
| 0.7527777777777778 | 173.709 |
| 0.7534722222222222 | 173.709 |
| 0.7541666666666668 | 173.709 |
| 0.7548611111111111 | 173.709 |
| 0.7555555555555555 | 173.709 |
| 0.75625 | 169.156 |
| 0.7569444444444445 | 169.156 |
| 0.7576388888888889 | 169.156 |
| 0.7583333333333333 | 169.156 |
| 0.7590277777777777 | 169.156 |
| 0.7597222222222223 | 169.156 |
| 0.7604166666666666 | 169.156 |
| 0.7611111111111111 | 169.156 |
| 0.7618055555555556 | 164.605 |
| 0.7625000000000001 | 155.509 |
| 0.7631944444444444 | 132.814 |
| 0.7638888888888888 | 128.284 |
| 0.7645833333333334 | 146.423 |
| 0.7652777777777778 | 137.347 |
| 0.7659722222222222 | 119.235 |
| 0.7666666666666666 | 114.716 |
| 0.7673611111111112 | 110.201 |
| 0.7680555555555556 | 105.69 |
| 0.7687499999999999 | 101.184 |
| 0.7694444444444444 | 101.184 |
| 0.7701388888888889 | 96.682 |
| 0.7708333333333334 | 92.184 |
| 0.7715277777777777 | 92.184 |
| 0.7722222222222223 | 92.184 |
| 0.7729166666666667 | 87.692 |
| 0.7736111111111111 | 87.692 |
| 0.7743055555555555 | 87.692 |
| 0.775 | 87.692 |
| 0.7756944444444445 | 87.692 |
| 0.7763888888888889 | 87.692 |
| 0.7770833333333332 | 92.184 |
| 0.7777777777777778 | 101.184 |
| 0.7784722222222222 | 96.682 |
| 0.7791666666666667 | 105.69 |
| 0.779861111111111 | 101.184 |
| 0.7805555555555556 | 101.184 |
| 0.78125 | 96.682 |
| 0.7819444444444444 | 92.184 |
| 0.782638888888889 | 92.184 |
| 0.7833333333333333 | 87.692 |
| 0.7840277777777778 | 83.205 |
| 0.7847222222222222 | 83.205 |
| 0.7854166666666668 | 83.205 |
| 0.7861111111111111 | 83.205 |
| 0.7868055555555555 | 83.205 |
| 0.7875 | 83.205 |
| 0.7881944444444445 | 83.205 |
| 0.7888888888888889 | 83.205 |
| 0.7895833333333333 | 83.205 |
| 0.7902777777777777 | 83.205 |
| 0.7909722222222223 | 83.205 |
| 0.7916666666666666 | 78.722 |
| 0.7923611111111111 | 74.246 |
| 0.7930555555555556 | 74.246 |
| 0.7937500000000001 | 69.775 |
| 0.7944444444444444 | 69.775 |
| 0.7951388888888888 | 69.775 |
| 0.7958333333333334 | 69.775 |
| 0.7965277777777778 | 69.775 |
| 0.7972222222222222 | 65.31 |
| 0.7979166666666666 | 65.31 |
| 0.7986111111111112 | 65.31 |
| 0.7993055555555556 | 60.85 |
| 0.7999999999999999 | 56.398 |
| 0.8006944444444444 | 56.398 |
| 0.8013888888888889 | 51.951 |
| 0.8020833333333334 | 47.511 |
| 0.8027777777777777 | 43.079 |
| 0.8034722222222223 | 38.653 |
| 0.8041666666666667 | 38.653 |
| 0.8048611111111111 | 38.653 |
| 0.8055555555555555 | 34.234 |
| 0.80625 | 34.234 |
| 0.8069444444444445 | 34.234 |
| 0.8076388888888889 | 34.234 |
| 0.8083333333333332 | 34.234 |
| 0.8090277777777778 | 34.234 |
| 0.8097222222222222 | 29.823 |
| 0.8104166666666667 | 29.823 |
| 0.811111111111111 | 29.823 |
| 0.8118055555555556 | 29.823 |
| 0.8125 | 25.419 |
| 0.8131944444444444 | 25.419 |
| 0.813888888888889 | 25.419 |
| 0.8145833333333333 | 21.024 |
| 0.8152777777777778 | 21.024 |
| 0.8159722222222222 | 21.024 |
| 0.8166666666666668 | 21.024 |
| 0.8173611111111111 | 16.636 |
| 0.8180555555555555 | 16.636 |
| 0.81875 | 12.257 |
| 0.8194444444444445 | 12.257 |
| 0.8201388888888889 | 12.257 |
| 0.8208333333333333 | 12.257 |
| 0.8215277777777777 | 7.887 |
| 0.8222222222222223 | 7.887 |
| 0.8229166666666666 | 7.887 |
| 0.8236111111111111 | 7.887 |
| 0.8243055555555556 | 7.887 |
| 0.8250000000000001 | 7.887 |
| 0.8256944444444444 | 3.525 |
| 0.8263888888888888 | 3.525 |
| 0.8270833333333334 | 3.525 |
| 0.8277777777777778 | 3.525 |
| 0.8284722222222222 | 3.525 |
| 0.8291666666666666 | 3.525 |
| 0.8298611111111112 | 3.525 |
| 0.8305555555555556 | 3.525 |
| 0.8312499999999999 | 0 |
| 0.8319444444444444 | 0 |
| 0.8326388888888889 | 0 |
| 0.8333333333333334 | 0 |
| 0.8340277777777777 | 0 |
| 0.8347222222222223 | 0 |
| 0.8354166666666667 | 0 |
| 0.8361111111111111 | 0 |
| 0.8368055555555555 | 0 |
| 0.8375 | 0 |
| 0.8381944444444445 | 0 |
| 0.8388888888888889 | 0 |
| 0.8395833333333332 | 0 |
| 0.8402777777777778 | 0 |
| 0.8409722222222222 | 0 |
| 0.8416666666666667 | 0 |
| 0.842361111111111 | 0 |
| 0.8430555555555556 | 0 |
| 0.84375 | 0 |
| 0.8444444444444444 | 0 |
| 0.845138888888889 | 0 |
| 0.8458333333333333 | 0 |
| 0.8465277777777778 | 0 |
| 0.8472222222222222 | 0 |
| 0.8479166666666668 | 0 |
| 0.8486111111111111 | 0 |
| 0.8493055555555555 | 0 |
| 0.85 | 0 |
| 0.8506944444444445 | 0 |
| 0.8513888888888889 | 0 |
| 0.8520833333333333 | 0 |
| 0.8527777777777777 | 0 |
| 0.8534722222222223 | 0 |
| 0.8541666666666666 | 0 |
| 0.8548611111111111 | 0 |
| 0.8555555555555556 | 0 |
| 0.8562500000000001 | 0 |
| 0.8569444444444444 | 0 |
| 0.8576388888888888 | 0 |
| 0.8583333333333334 | 0 |
| 0.8590277777777778 | 0 |
| 0.8597222222222222 | 0 |
| 0.8604166666666666 | 0 |
| 0.8611111111111112 | 0 |
| 0.8618055555555556 | 0 |
| 0.8624999999999999 | 0 |
| 0.8631944444444444 | 0 |
| 0.8638888888888889 | 0 |
| 0.8645833333333334 | 0 |
| 0.8652777777777777 | 0 |
| 0.8659722222222223 | 0 |
| 0.8666666666666667 | 0 |
| 0.8673611111111111 | 0 |
| 0.8680555555555555 | 0 |
| 0.86875 | 0 |
| 0.8694444444444445 | 0 |
| 0.8701388888888889 | 0 |
| 0.8708333333333332 | 0 |
| 0.8715277777777778 | 0 |
| 0.8722222222222222 | 0 |
| 0.8729166666666667 | 0 |
| 0.873611111111111 | 0 |
| 0.8743055555555556 | 0 |
| 0.875 | 0 |
| 0.8756944444444444 | 0 |
| 0.876388888888889 | 0 |
| 0.8770833333333333 | 0 |
| 0.8777777777777778 | 0 |
| 0.8784722222222222 | 0 |
| 0.8791666666666668 | 0 |
| 0.8798611111111111 | 0 |
| 0.8805555555555555 | 0 |
| 0.88125 | 0 |
| 0.8819444444444445 | 0 |
| 0.8826388888888889 | 0 |
| 0.8833333333333333 | 0 |
| 0.8840277777777777 | 0 |
| 0.8847222222222223 | 0 |
| 0.8854166666666666 | 0 |
| 0.8861111111111111 | 0 |
| 0.8868055555555556 | 0 |
| 0.8875000000000001 | 0 |
| 0.8881944444444444 | 0 |
| 0.8888888888888888 | 0 |
| 0.8895833333333334 | 0 |
| 0.8902777777777778 | 0 |
| 0.8909722222222222 | 0 |
| 0.8916666666666666 | 0 |
| 0.8923611111111112 | 0 |
| 0.8930555555555556 | 0 |
| 0.8937499999999999 | 0 |
| 0.8944444444444444 | 0 |
| 0.8951388888888889 | 0 |
| 0.8958333333333334 | 0 |
| 0.8965277777777777 | 0 |
| 0.8972222222222223 | 0 |
| 0.8979166666666667 | 0 |
| 0.8986111111111111 | 0 |
| 0.8993055555555555 | 0 |
| 0.9 | 0 |
| 0.9006944444444445 | 0 |
| 0.9013888888888889 | 0 |
| 0.9020833333333332 | 0 |
| 0.9027777777777778 | 0 |
| 0.9034722222222222 | 0 |
| 0.9041666666666667 | 0 |
| 0.904861111111111 | 0 |
| 0.9055555555555556 | 0 |
| 0.90625 | 0 |
| 0.9069444444444444 | 0 |
| 0.907638888888889 | 0 |
| 0.9083333333333333 | 0 |
| 0.9090277777777778 | 0 |
| 0.9097222222222222 | 0 |
| 0.9104166666666668 | 0 |
| 0.9111111111111111 | 0 |
| 0.9118055555555555 | 0 |
| 0.9125 | 0 |
| 0.9131944444444445 | 0 |
| 0.9138888888888889 | 0 |
| 0.9145833333333333 | 0 |
| 0.9152777777777777 | 0 |
| 0.9159722222222223 | 0 |
| 0.9166666666666666 | 0 |
| 0.9173611111111111 | 0 |
| 0.9180555555555556 | 0 |
| 0.9187500000000001 | 0 |
| 0.9194444444444444 | 0 |
| 0.9201388888888888 | 0 |
| 0.9208333333333334 | 0 |
| 0.9215277777777778 | 0 |
| 0.9222222222222222 | 0 |
| 0.9229166666666666 | 0 |
| 0.9236111111111112 | 0 |
| 0.9243055555555556 | 0 |
| 0.9249999999999999 | 0 |
| 0.9256944444444444 | 0 |
| 0.9263888888888889 | 0 |
| 0.9270833333333334 | 0 |
| 0.9277777777777777 | 0 |
| 0.9284722222222223 | 0 |
| 0.9291666666666667 | 0 |
| 0.9298611111111111 | 0 |
| 0.9305555555555555 | 0 |
| 0.93125 | 0 |
| 0.9319444444444445 | 0 |
| 0.9326388888888889 | 0 |
| 0.9333333333333332 | 0 |
| 0.9340277777777778 | 0 |
| 0.9347222222222222 | 0 |
| 0.9354166666666667 | 0 |
| 0.936111111111111 | 0 |
| 0.9368055555555556 | 0 |
| 0.9375 | 0 |
| 0.9381944444444444 | 0 |
| 0.938888888888889 | 0 |
| 0.9395833333333333 | 0 |
| 0.9402777777777778 | 0 |
| 0.9409722222222222 | 0 |
| 0.9416666666666668 | 0 |
| 0.9423611111111111 | 0 |
| 0.9430555555555555 | 0 |
| 0.94375 | 0 |
| 0.9444444444444445 | 0 |
| 0.9451388888888889 | 0 |
| 0.9458333333333333 | 0 |
| 0.9465277777777777 | 0 |
| 0.9472222222222223 | 0 |
| 0.9479166666666666 | 0 |
| 0.9486111111111111 | 0 |
| 0.9493055555555556 | 0 |
| 0.9500000000000001 | 0 |
| 0.9506944444444444 | 0 |
| 0.9513888888888888 | 0 |
| 0.9520833333333334 | 0 |
| 0.9527777777777778 | 0 |
| 0.9534722222222222 | 0 |
| 0.9541666666666666 | 0 |
| 0.9548611111111112 | 0 |
| 0.9555555555555556 | 0 |
| 0.9562499999999999 | 0 |
| 0.9569444444444444 | 0 |
| 0.9576388888888889 | 0 |
| 0.9583333333333334 | 0 |
| 0.9590277777777777 | 0 |
| 0.9597222222222223 | 0 |
| 0.9604166666666667 | 0 |
| 0.9611111111111111 | 0 |
| 0.9618055555555555 | 0 |
| 0.9625 | 0 |
| 0.9631944444444445 | 0 |
| 0.9638888888888889 | 0 |
| 0.9645833333333332 | 0 |
| 0.9652777777777778 | 0 |
| 0.9659722222222222 | 0 |
| 0.9666666666666667 | 0 |
| 0.967361111111111 | 0 |
| 0.9680555555555556 | 0 |
| 0.96875 | 0 |
| 0.9694444444444444 | 0 |
| 0.970138888888889 | 0 |
| 0.9708333333333333 | 0 |
| 0.9715277777777778 | 0 |
| 0.9722222222222222 | 0 |
| 0.9729166666666668 | 0 |
| 0.9736111111111111 | 0 |
| 0.9743055555555555 | 0 |
| 0.975 | 0 |
| 0.9756944444444445 | 0 |
| 0.9763888888888889 | 0 |
| 0.9770833333333333 | 0 |
| 0.9777777777777777 | 0 |
| 0.9784722222222223 | 0 |
| 0.9791666666666666 | 0 |
| 0.9798611111111111 | 0 |
| 0.9805555555555556 | 0 |
| 0.9812500000000001 | 0 |
| 0.9819444444444444 | 0 |
| 0.9826388888888888 | 0 |
| 0.9833333333333334 | 0 |
| 0.9840277777777778 | 0 |
| 0.9847222222222222 | 0 |
| 0.9854166666666666 | 0 |
| 0.9861111111111112 | 0 |
| 0.9868055555555556 | 0 |
| 0.9874999999999999 | 0 |
| 0.9881944444444444 | 0 |
| 0.9888888888888889 | 0 |
| 0.9895833333333334 | 0 |
| 0.9902777777777777 | 0 |
| 0.9909722222222223 | 0 |
| 0.9916666666666667 | 0 |
| 0.9923611111111111 | 0 |
| 0.9930555555555555 | 0 |
| 0.99375 | 0 |
| 0.9944444444444445 | 0 |
| 0.9951388888888889 | 0 |
| 0.9958333333333332 | 0 |
| 0.9965277777777778 | 0 |
| 0.9972222222222222 | 0 |
| 0.9979166666666667 | 0 |
| 0.998611111111111 | 0 |
| 0.9993055555555556 | 0 |